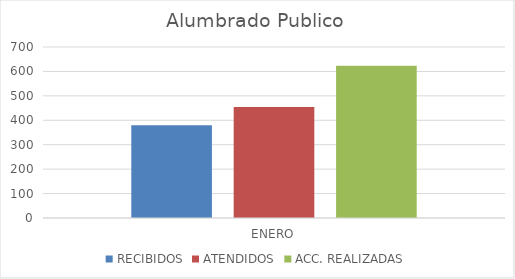
| Category | RECIBIDOS | ATENDIDOS | ACC. REALIZADAS |
|---|---|---|---|
| ENERO | 380 | 454 | 623 |